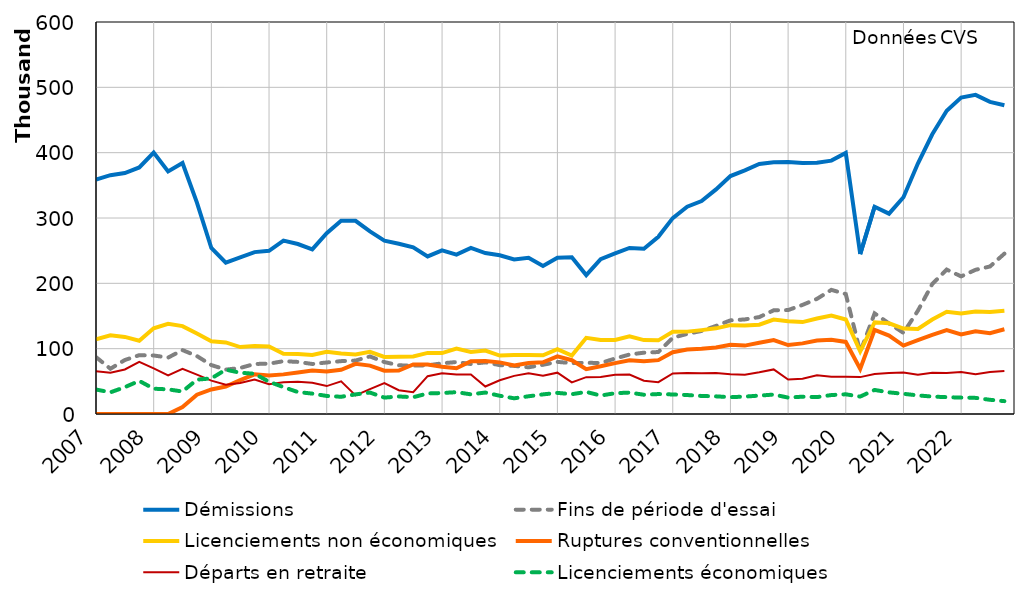
| Category | Démissions | Fins de période d'essai | Licenciements non économiques | Ruptures conventionnelles | Départs en retraite | Licenciements économiques |
|---|---|---|---|---|---|---|
| 2007-01-01 | 358869 | 87086 | 114461 | 0 | 65409 | 37456 |
| 2007-04-01 | 365529 | 69287 | 120507 | 0 | 63191 | 33182 |
| 2007-07-01 | 368847 | 82614 | 117955 | 0 | 68148 | 41081 |
| 2007-10-01 | 377410 | 90019 | 112162 | 0 | 79881 | 50695 |
| 2008-01-01 | 400273 | 89577 | 131160 | 0 | 69826 | 38690 |
| 2008-04-01 | 371335 | 86333 | 138099 | 0 | 59254 | 37718 |
| 2008-07-01 | 384268 | 97828 | 134517 | 10735 | 69226 | 34405 |
| 2008-10-01 | 323506 | 88667 | 123304 | 29628 | 60278 | 52605 |
| 2009-01-01 | 254051 | 74869 | 111281 | 37595 | 51018 | 54471 |
| 2009-04-01 | 231583 | 67941 | 109592 | 42083 | 44798 | 67876 |
| 2009-07-01 | 239659 | 70450 | 102460 | 51953 | 47448 | 63164 |
| 2009-10-01 | 247804 | 76580 | 104134 | 60645 | 52805 | 61591 |
| 2010-01-01 | 249793 | 77029 | 103258 | 58913 | 45519 | 49397 |
| 2010-04-01 | 265482 | 80857 | 92058 | 60657 | 48431 | 41131 |
| 2010-07-01 | 260163 | 79710 | 91804 | 63643 | 49317 | 33597 |
| 2010-10-01 | 252101 | 76559 | 90397 | 66424 | 47932 | 31196 |
| 2011-01-01 | 276833 | 78844 | 95369 | 65192 | 42738 | 27635 |
| 2011-04-01 | 295760 | 80911 | 92539 | 67608 | 49934 | 26365 |
| 2011-07-01 | 295651 | 81786 | 90956 | 76777 | 28427 | 30033 |
| 2011-10-01 | 279474 | 88087 | 95148 | 74049 | 38040 | 32801 |
| 2012-01-01 | 265437 | 79505 | 87419 | 66279 | 47236 | 25122 |
| 2012-04-01 | 260623 | 74557 | 87633 | 66418 | 36472 | 26833 |
| 2012-07-01 | 255026 | 73982 | 88105 | 75859 | 33491 | 25652 |
| 2012-10-01 | 241196 | 74446 | 93480 | 75679 | 57920 | 31485 |
| 2013-01-01 | 250579 | 77583 | 93226 | 72355 | 62516 | 32117 |
| 2013-04-01 | 244032 | 79547 | 100164 | 70045 | 60542 | 33415 |
| 2013-07-01 | 254309 | 76454 | 95092 | 80843 | 60591 | 30097 |
| 2013-10-01 | 246341 | 79088 | 97128 | 81065 | 42040 | 32833 |
| 2014-01-01 | 243001 | 74793 | 89510 | 79039 | 51702 | 27928 |
| 2014-04-01 | 236648 | 73638 | 90406 | 74337 | 58348 | 24034 |
| 2014-07-01 | 239068 | 71480 | 90223 | 78081 | 62390 | 27134 |
| 2014-10-01 | 226478 | 75347 | 89763 | 79021 | 58405 | 30014 |
| 2015-01-01 | 239203 | 79792 | 99154 | 88279 | 63229 | 32349 |
| 2015-04-01 | 239996 | 77784 | 89541 | 82324 | 48479 | 30293 |
| 2015-07-01 | 212674 | 78439 | 116595 | 68601 | 56412 | 33827 |
| 2015-10-01 | 237080 | 78009 | 113160 | 72985 | 56614 | 28205 |
| 2016-01-01 | 245860 | 84916 | 113329 | 77914 | 60022 | 31831 |
| 2016-04-01 | 254150 | 91028 | 118869 | 82178 | 60461 | 32787 |
| 2016-07-01 | 252912 | 93858 | 113123 | 80823 | 50856 | 29477 |
| 2016-10-01 | 271278 | 94862 | 112720 | 82418 | 48668 | 30510 |
| 2017-01-01 | 299822 | 116704 | 125770 | 94620 | 62105 | 29932 |
| 2017-04-01 | 317379 | 122606 | 126084 | 98843 | 62716 | 29014 |
| 2017-07-01 | 325855 | 127117 | 128395 | 99897 | 62338 | 27617 |
| 2017-10-01 | 343822 | 134847 | 131082 | 101793 | 62693 | 27006 |
| 2018-01-01 | 364259 | 143315 | 135997 | 106099 | 60759 | 25758 |
| 2018-04-01 | 373020 | 144778 | 135381 | 104675 | 59922 | 26636 |
| 2018-07-01 | 382680 | 148340 | 136737 | 108936 | 63749 | 28142 |
| 2018-10-01 | 385186 | 158713 | 144519 | 113227 | 68252 | 29733 |
| 2019-01-01 | 385709 | 159055 | 142101 | 105484 | 52727 | 25131 |
| 2019-04-01 | 384108 | 167006 | 140699 | 108067 | 54103 | 26514 |
| 2019-07-01 | 384445 | 176203 | 146165 | 112360 | 59122 | 25842 |
| 2019-10-01 | 387847 | 190036 | 150661 | 113554 | 57157 | 28983 |
| 2020-01-01 | 399693 | 183578 | 144567 | 110303 | 57180 | 30148 |
| 2020-04-01 | 244798 | 94968 | 95851 | 69121 | 56473 | 26684 |
| 2020-07-01 | 317271 | 153965 | 140380 | 128819 | 61057 | 36812 |
| 2020-10-01 | 306628 | 138593 | 138853 | 120054 | 62718 | 33085 |
| 2021-01-01 | 331838 | 124209 | 130702 | 104730 | 63644 | 30927 |
| 2021-04-01 | 383412 | 158077 | 130127 | 113144 | 60233 | 28472 |
| 2021-07-01 | 428181 | 199015 | 144587 | 121204 | 63121 | 26655 |
| 2021-10-01 | 464282 | 220992 | 156387 | 128452 | 62885 | 25760 |
| 2022-01-01 | 484348 | 210656 | 153779 | 121828 | 64328 | 25113 |
| 2022-04-01 | 488443 | 220706 | 156761 | 126736 | 61031 | 24673 |
| 2022-07-01 | 477725 | 225770 | 156066 | 123798 | 64113 | 21733 |
| 2022-10-01 | 472617 | 245433 | 157880 | 129643 | 65731 | 19663 |